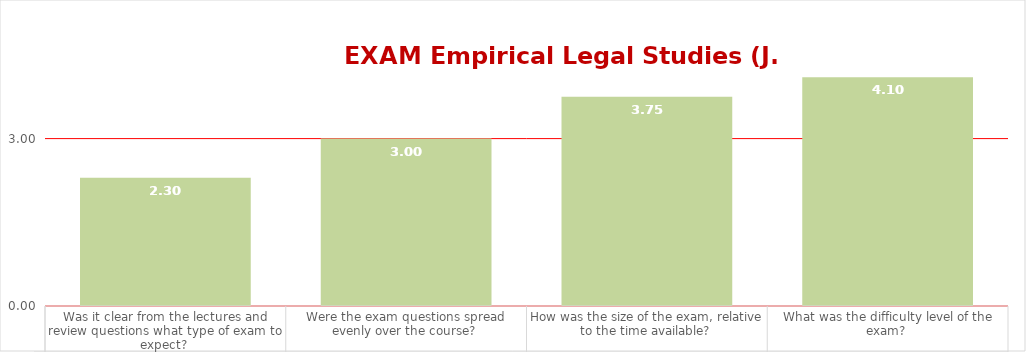
| Category | Series 0 |
|---|---|
| Was it clear from the lectures and review questions what type of exam to expect?  | 2.3 |
| Were the exam questions spread evenly over the course?  | 3 |
| How was the size of the exam, relative to the time available?  | 3.75 |
| What was the difficulty level of the exam?  | 4.1 |